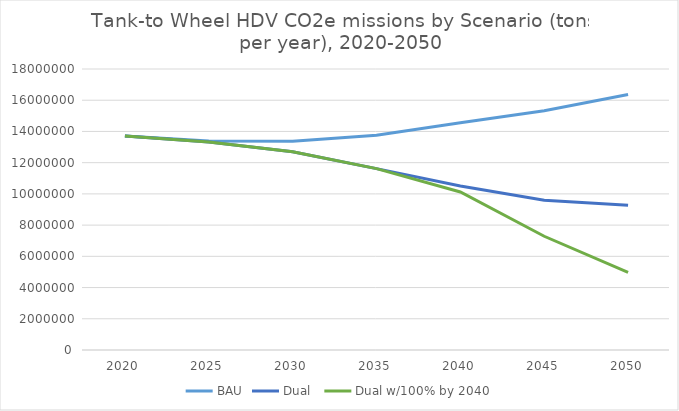
| Category | BAU | Dual  | Dual w/100% by 2040 |
|---|---|---|---|
| 2020.0 | 13702070.439 | 13702070.439 | 13702070.439 |
| 2025.0 | 13381443.119 | 13321849.41 | 13321849.41 |
| 2030.0 | 13371411.719 | 12699023.144 | 12699023.144 |
| 2035.0 | 13750459.519 | 11616597.617 | 11616597.617 |
| 2040.0 | 14561211.984 | 10505883.295 | 10122388.191 |
| 2045.0 | 15325820.837 | 9594461.144 | 7286089.901 |
| 2050.0 | 16362004.106 | 9278553.235 | 4966946.155 |